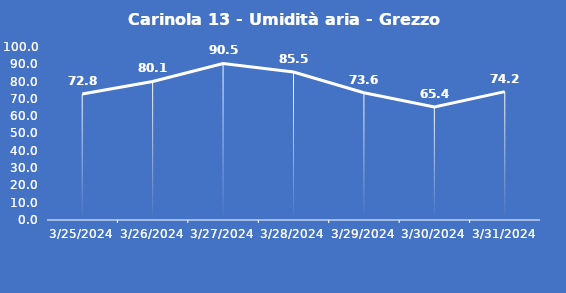
| Category | Carinola 13 - Umidità aria - Grezzo (%) |
|---|---|
| 3/25/24 | 72.8 |
| 3/26/24 | 80.1 |
| 3/27/24 | 90.5 |
| 3/28/24 | 85.5 |
| 3/29/24 | 73.6 |
| 3/30/24 | 65.4 |
| 3/31/24 | 74.2 |